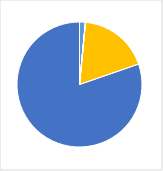
| Category | Series 0 |
|---|---|
| 0 | 0.014 |
| 1 | 0 |
| 2 | 0 |
| 3 | 0.174 |
| 4 | 0.768 |